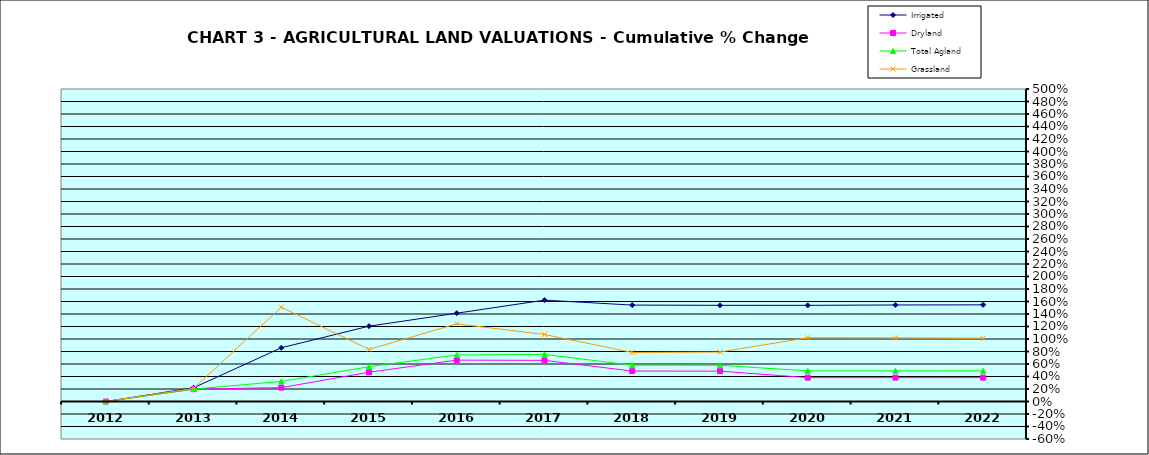
| Category | Irrigated | Dryland | Total Agland | Grassland |
|---|---|---|---|---|
| 2012.0 | 0 | 0 | 0 | 0 |
| 2013.0 | 0.22 | 0.197 | 0.199 | 0.209 |
| 2014.0 | 0.86 | 0.222 | 0.321 | 1.509 |
| 2015.0 | 1.205 | 0.469 | 0.557 | 0.833 |
| 2016.0 | 1.413 | 0.662 | 0.744 | 1.243 |
| 2017.0 | 1.622 | 0.658 | 0.754 | 1.072 |
| 2018.0 | 1.543 | 0.487 | 0.581 | 0.785 |
| 2019.0 | 1.539 | 0.486 | 0.579 | 0.791 |
| 2020.0 | 1.538 | 0.382 | 0.49 | 1.02 |
| 2021.0 | 1.544 | 0.382 | 0.49 | 1.018 |
| 2022.0 | 1.546 | 0.382 | 0.491 | 1.012 |